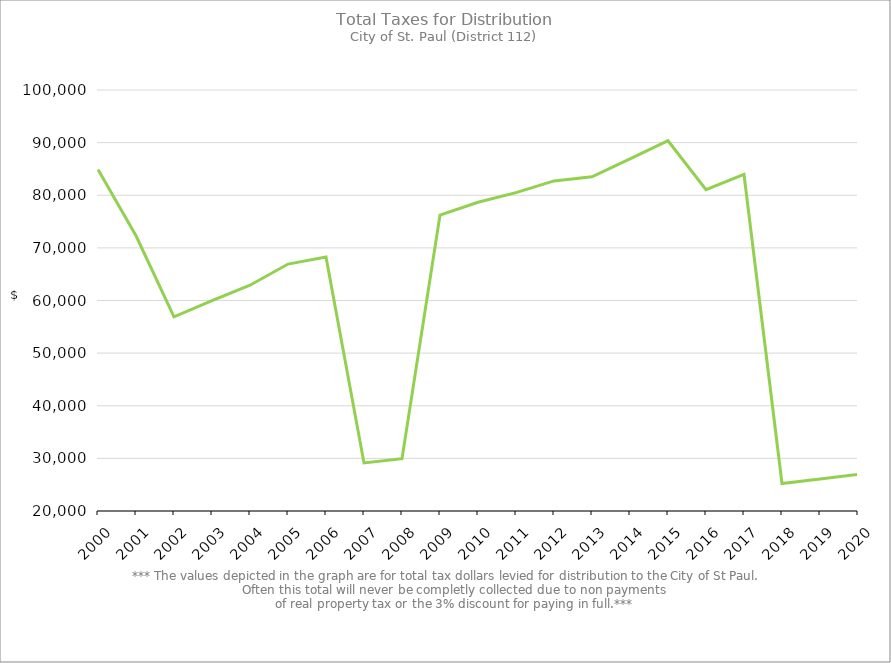
| Category | Series 0 |
|---|---|
| 2000.0 | 84877.52 |
| 2001.0 | 72302.26 |
| 2002.0 | 56900.52 |
| 2003.0 | 59986.93 |
| 2004.0 | 62897.07 |
| 2005.0 | 66924.6 |
| 2006.0 | 68259.77 |
| 2007.0 | 29140.14 |
| 2008.0 | 29932.99 |
| 2009.0 | 76222.93 |
| 2010.0 | 78668.43 |
| 2011.0 | 80504.7 |
| 2012.0 | 82726.89 |
| 2013.0 | 83495.07 |
| 2014.0 | 86897.21 |
| 2015.0 | 90362.8 |
| 2016.0 | 81047.38 |
| 2017.0 | 83946.67 |
| 2018.0 | 25219.34 |
| 2019.0 | 26075.54 |
| 2020.0 | 26964.18 |